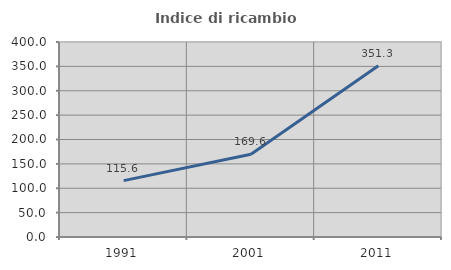
| Category | Indice di ricambio occupazionale  |
|---|---|
| 1991.0 | 115.624 |
| 2001.0 | 169.649 |
| 2011.0 | 351.305 |